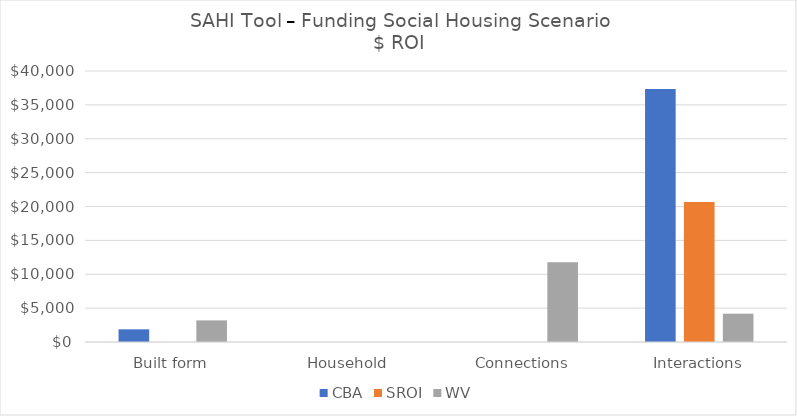
| Category | CBA | SROI | WV |
|---|---|---|---|
| Built form | 1872 | 0 | 3187.5 |
| Household | 0 | 0 | 0 |
| Connections | 0 | 0 | 11784.4 |
| Interactions | 37344.9 | 20670 | 4176.9 |